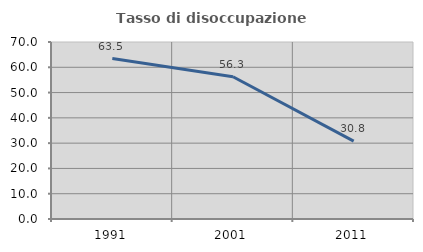
| Category | Tasso di disoccupazione giovanile  |
|---|---|
| 1991.0 | 63.462 |
| 2001.0 | 56.25 |
| 2011.0 | 30.769 |